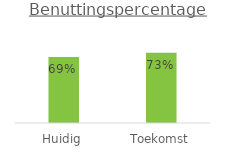
| Category | Benuttingspercentage |
|---|---|
| Huidig | 0.687 |
| Toekomst | 0.731 |